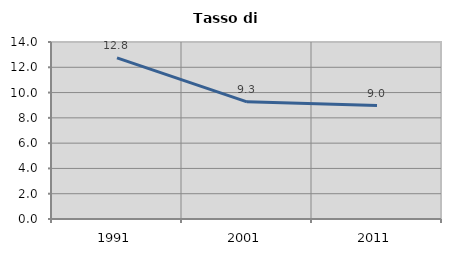
| Category | Tasso di disoccupazione   |
|---|---|
| 1991.0 | 12.75 |
| 2001.0 | 9.269 |
| 2011.0 | 8.976 |